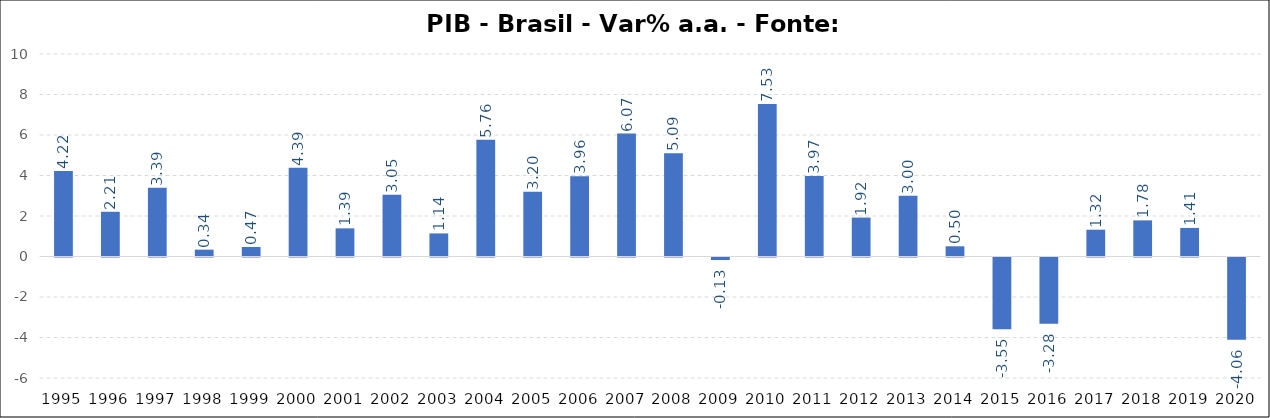
| Category | PIB - Brasil - Var% a.a. - Fonte: IBGE |
|---|---|
| 1995.0 | 4.224 |
| 1996.0 | 2.209 |
| 1997.0 | 3.395 |
| 1998.0 | 0.338 |
| 1999.0 | 0.468 |
| 2000.0 | 4.388 |
| 2001.0 | 1.39 |
| 2002.0 | 3.053 |
| 2003.0 | 1.141 |
| 2004.0 | 5.76 |
| 2005.0 | 3.202 |
| 2006.0 | 3.962 |
| 2007.0 | 6.07 |
| 2008.0 | 5.094 |
| 2009.0 | -0.126 |
| 2010.0 | 7.528 |
| 2011.0 | 3.974 |
| 2012.0 | 1.921 |
| 2013.0 | 3.005 |
| 2014.0 | 0.504 |
| 2015.0 | -3.546 |
| 2016.0 | -3.276 |
| 2017.0 | 1.323 |
| 2018.0 | 1.784 |
| 2019.0 | 1.411 |
| 2020.0 | -4.059 |